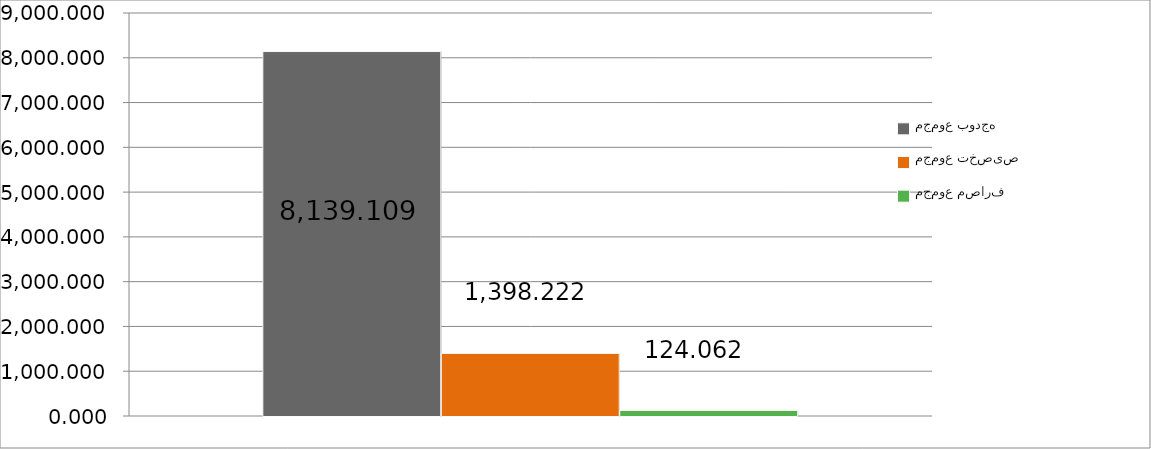
| Category | مجموع بودجه  | مجموع تخصیص | مجموع مصارف |
|---|---|---|---|
| 0 | 8139.109 | 1398.222 | 124.062 |